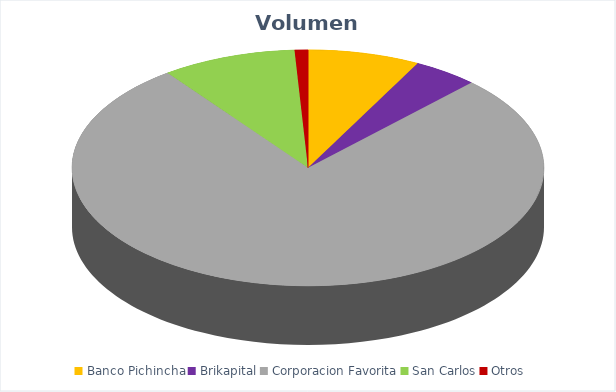
| Category | VOLUMEN ($USD) |
|---|---|
| Banco Pichincha | 3430 |
| Brikapital | 2000 |
| Corporacion Favorita | 34725.8 |
| San Carlos | 4125 |
| Otros | 405.92 |